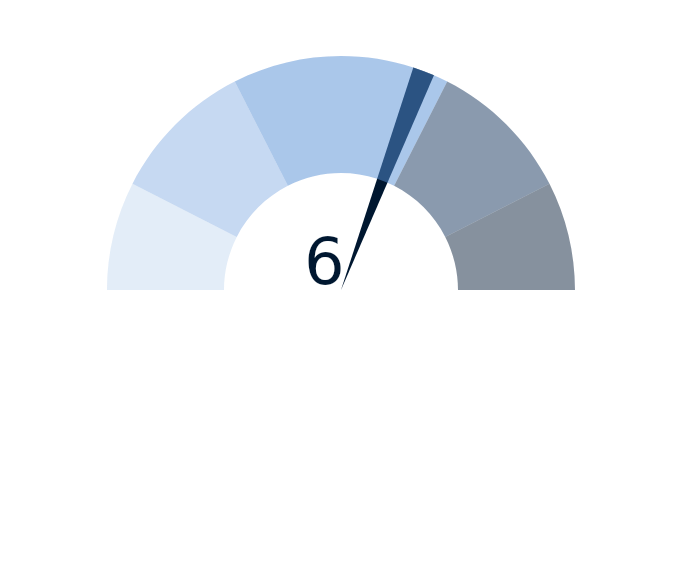
| Category | factor |
|---|---|
| 0 | 6 |
| 1 | 0.3 |
| 2 | 13.7 |